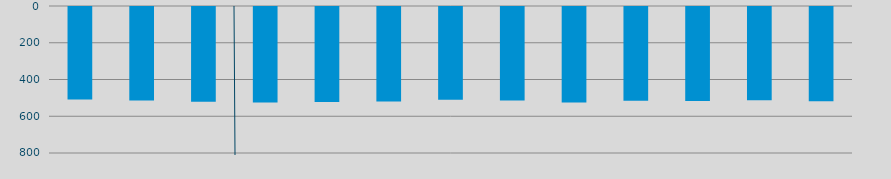
| Category | Energía a bajar | Energía a subir |
|---|---|---|
| O | 502.757 |  |
| N | 509.389 |  |
| D | 515.349 |  |
| E | 520.032 |  |
| F | 516.897 |  |
| M | 513.61 |  |
| A | 504.985 |  |
| M | 508.805 |  |
| J | 519.464 |  |
| J | 510.745 |  |
| A | 512.124 |  |
| S | 507.342 |  |
| O | 513.588 |  |